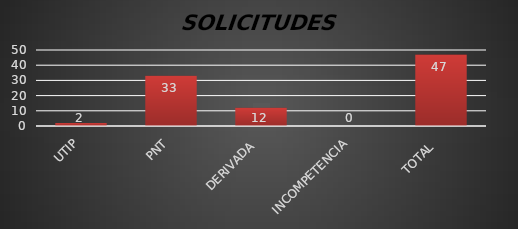
| Category | Series 1 |
|---|---|
| UTIP | 2 |
| PNT | 33 |
| DERIVADA  | 12 |
| INCOMPETENCIA | 0 |
| TOTAL  | 47 |